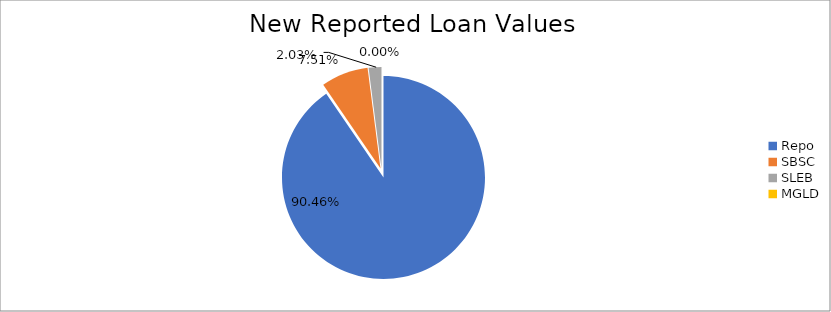
| Category | Series 0 |
|---|---|
| Repo | 10305772.965 |
| SBSC | 855048.529 |
| SLEB | 231820.008 |
| MGLD | 121.978 |